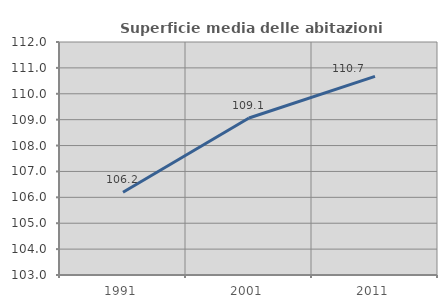
| Category | Superficie media delle abitazioni occupate |
|---|---|
| 1991.0 | 106.198 |
| 2001.0 | 109.065 |
| 2011.0 | 110.673 |